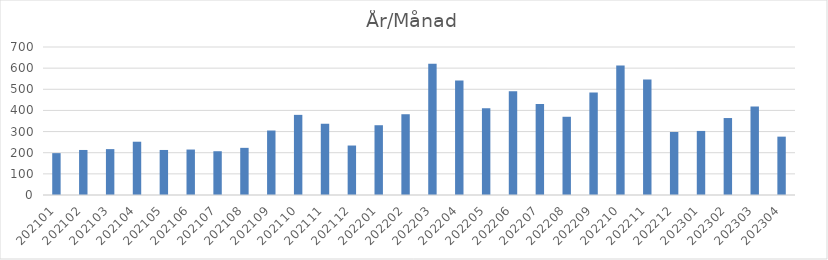
| Category | Summa |
|---|---|
| 202101 | 198 |
| 202102 | 213 |
| 202103 | 217 |
| 202104 | 252 |
| 202105 | 213 |
| 202106 | 215 |
| 202107 | 207 |
| 202108 | 223 |
| 202109 | 305 |
| 202110 | 379 |
| 202111 | 337 |
| 202112 | 234 |
| 202201 | 330 |
| 202202 | 382 |
| 202203 | 621 |
| 202204 | 542 |
| 202205 | 410 |
| 202206 | 491 |
| 202207 | 430 |
| 202208 | 370 |
| 202209 | 485 |
| 202210 | 612 |
| 202211 | 546 |
| 202212 | 298 |
| 202301 | 303 |
| 202302 | 364 |
| 202303 | 418 |
| 202304 | 276 |